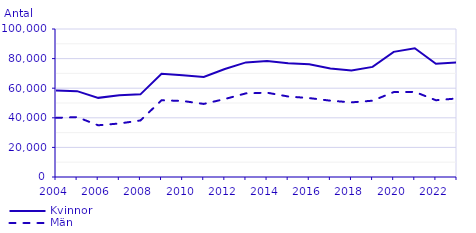
| Category | Kvinnor | Män |
|---|---|---|
| 2004.0 | 58434 | 39957 |
| 2005.0 | 58019 | 40481 |
| 2006.0 | 53471 | 34944 |
| 2007.0 | 55277 | 36155 |
| 2008.0 | 55847 | 38199 |
| 2009.0 | 69814 | 51848 |
| 2010.0 | 68674 | 51375 |
| 2011.0 | 67596 | 49376 |
| 2012.0 | 72998 | 52689 |
| 2013.0 | 77428 | 56510 |
| 2014.0 | 78294 | 56964 |
| 2015.0 | 76874 | 54394 |
| 2016.0 | 76183 | 53326 |
| 2017.0 | 73362 | 51564 |
| 2018.0 | 71948 | 50424 |
| 2019.0 | 74383 | 51558 |
| 2020.0 | 84567 | 57357 |
| 2021.0 | 86992 | 57509 |
| 2022.0 | 76504 | 51868 |
| 2023.0 | 77440 | 53068 |